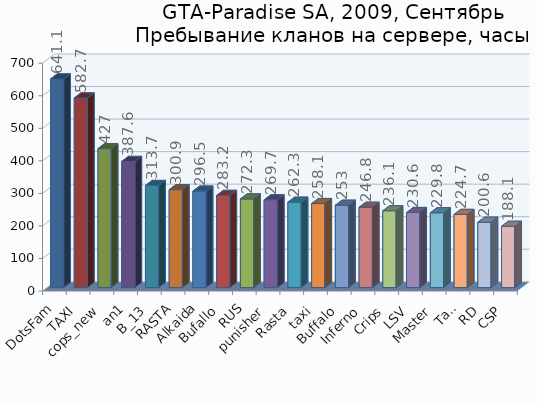
| Category | Series 0 |
|---|---|
| DotsFam | 641.1 |
| TAXI | 582.7 |
| cops_new | 427 |
| an1 | 387.6 |
| B_13 | 313.7 |
| RASTA | 300.9 |
| Alkaida | 296.5 |
| Bufallo | 283.2 |
| RUS | 272.3 |
| punisher | 269.7 |
| Rasta | 262.3 |
| taxi | 258.1 |
| Buffalo | 253 |
| Inferno | 246.8 |
| Crips | 236.1 |
| LSV | 230.6 |
| Master | 229.8 |
| Taxi | 224.7 |
| RD | 200.6 |
| CSP | 188.1 |